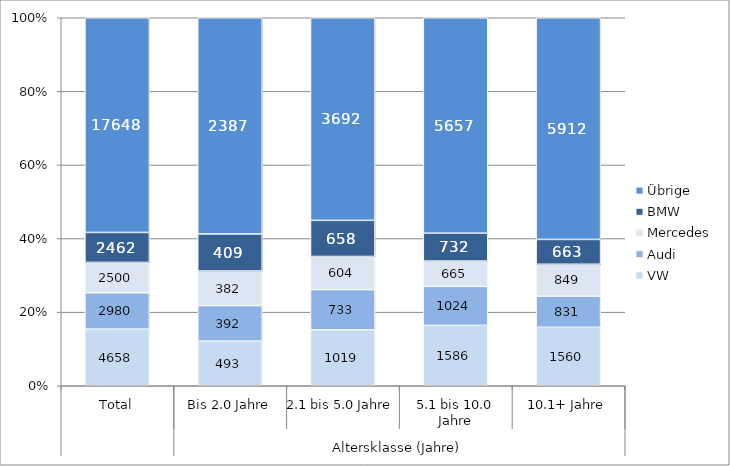
| Category | VW | Audi | Mercedes | BMW | Übrige |
|---|---|---|---|---|---|
| 0 | 4658 | 2980 | 2500 | 2462 | 17648 |
| 1 | 493 | 392 | 382 | 409 | 2387 |
| 2 | 1019 | 733 | 604 | 658 | 3692 |
| 3 | 1586 | 1024 | 665 | 732 | 5657 |
| 4 | 1560 | 831 | 849 | 663 | 5912 |